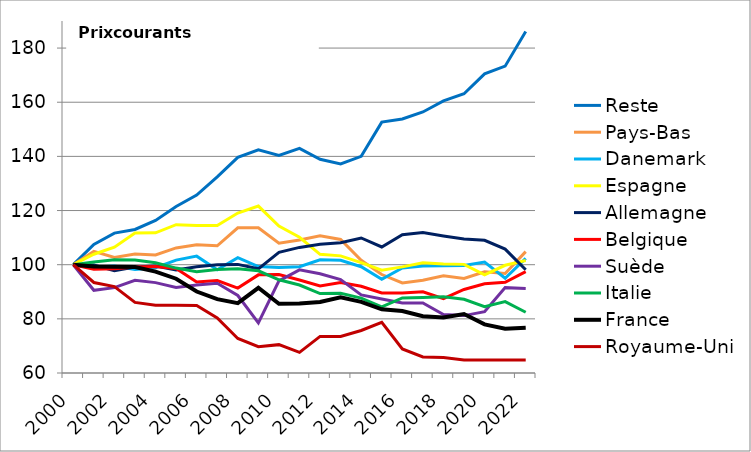
| Category | Reste | Pays-Bas | Danemark | Espagne | Allemagne  | Belgique | Suède | Italie | France | Royaume-Uni |
|---|---|---|---|---|---|---|---|---|---|---|
| 2000 | 100 | 100 | 100 | 100 | 100 | 100 | 100 | 100 | 100 | 100 |
| 2001 | 107.495 | 104.934 | 99.021 | 103.864 | 99.908 | 98.348 | 90.547 | 100.962 | 99.34 | 93.427 |
| 2002 | 111.668 | 102.664 | 99.489 | 106.487 | 97.792 | 98.524 | 91.523 | 101.824 | 99.257 | 91.922 |
| 2003 | 113.011 | 103.94 | 98.249 | 111.668 | 99.167 | 99.182 | 94.234 | 101.717 | 99.15 | 86.074 |
| 2004 | 116.346 | 103.568 | 98.867 | 111.782 | 99.531 | 99.32 | 93.379 | 100.721 | 97.452 | 85.043 |
| 2005 | 121.511 | 106.189 | 101.701 | 114.785 | 98.084 | 98.637 | 91.6 | 98.747 | 94.829 | 85.041 |
| 2006 | 125.717 | 107.36 | 103.155 | 114.455 | 99.256 | 93.594 | 92.513 | 97.432 | 90.084 | 84.912 |
| 2007 | 132.442 | 106.969 | 98.146 | 114.455 | 99.973 | 94.134 | 93.149 | 98.186 | 87.266 | 80.369 |
| 2008 | 139.618 | 113.639 | 102.57 | 119.077 | 100.107 | 91.342 | 88.624 | 98.526 | 85.791 | 72.742 |
| 2009 | 142.387 | 113.669 | 99.288 | 121.653 | 98.483 | 96.242 | 78.501 | 97.739 | 91.475 | 69.716 |
| 2010 | 140.316 | 107.915 | 99.009 | 114.256 | 104.543 | 96.342 | 94.034 | 94.415 | 85.54 | 70.47 |
| 2011 | 142.971 | 109.154 | 99.233 | 110.13 | 106.382 | 94.36 | 98.087 | 92.495 | 85.687 | 67.629 |
| 2012 | 138.952 | 110.638 | 101.824 | 103.845 | 107.572 | 92.18 | 96.643 | 89.352 | 86.242 | 73.522 |
| 2013 | 137.218 | 109.315 | 101.61 | 103.258 | 108.091 | 93.443 | 94.517 | 89.459 | 87.999 | 73.466 |
| 2014 | 140.007 | 101.604 | 99.261 | 100.744 | 109.858 | 92.032 | 88.823 | 87.668 | 86.277 | 75.698 |
| 2015 | 152.657 | 96.37 | 94.597 | 97.995 | 106.536 | 89.538 | 87.339 | 84.391 | 83.541 | 78.69 |
| 2016 | 153.83 | 93.235 | 98.806 | 99.199 | 111.059 | 89.585 | 85.891 | 87.726 | 82.885 | 68.867 |
| 2017 | 156.395 | 94.224 | 99.519 | 100.746 | 111.89 | 89.971 | 85.867 | 87.899 | 80.984 | 65.902 |
| 2018 | 160.51 | 95.9 | 99.599 | 100.232 | 110.62 | 87.442 | 81.581 | 88.161 | 80.493 | 65.742 |
| 2019 | 163.126 | 94.945 | 99.735 | 100.118 | 109.491 | 90.837 | 81.193 | 87.237 | 81.769 | 64.832 |
| 2020 | 170.466 | 97.374 | 101.007 | 96.237 | 109.023 | 92.935 | 82.645 | 84.49 | 77.958 | 64.829 |
| 2021 | 173.324 | 96.761 | 94.993 | 99.787 | 105.753 | 93.517 | 91.522 | 86.38 | 76.34 | 64.829 |
| 2022 | 186.123 | 104.83 | 102.325 | 101.567 | 98.143 | 97.414 | 91.241 | 82.45 | 76.696 | 64.829 |